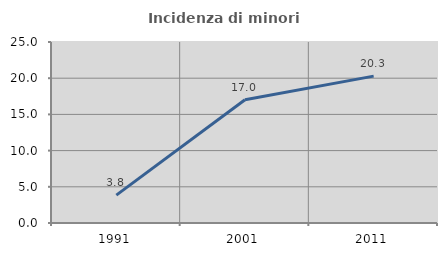
| Category | Incidenza di minori stranieri |
|---|---|
| 1991.0 | 3.846 |
| 2001.0 | 17.021 |
| 2011.0 | 20.29 |